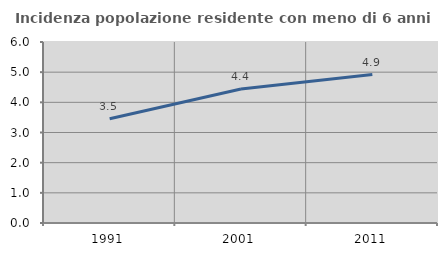
| Category | Incidenza popolazione residente con meno di 6 anni |
|---|---|
| 1991.0 | 3.454 |
| 2001.0 | 4.443 |
| 2011.0 | 4.922 |